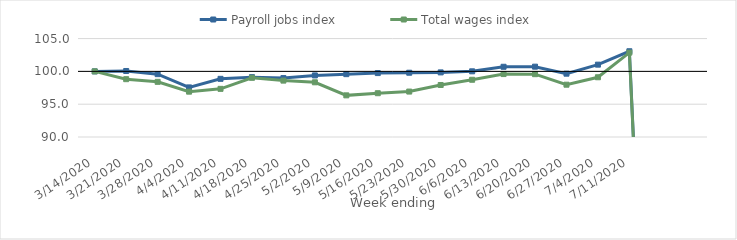
| Category | Payroll jobs index | Total wages index |
|---|---|---|
| 14/03/2020 | 100 | 100 |
| 21/03/2020 | 100.059 | 98.811 |
| 28/03/2020 | 99.578 | 98.405 |
| 04/04/2020 | 97.558 | 96.908 |
| 11/04/2020 | 98.864 | 97.336 |
| 18/04/2020 | 99.121 | 99.022 |
| 25/04/2020 | 98.978 | 98.592 |
| 02/05/2020 | 99.384 | 98.333 |
| 09/05/2020 | 99.575 | 96.346 |
| 16/05/2020 | 99.739 | 96.674 |
| 23/05/2020 | 99.795 | 96.922 |
| 30/05/2020 | 99.845 | 97.926 |
| 06/06/2020 | 100.008 | 98.722 |
| 13/06/2020 | 100.7 | 99.588 |
| 20/06/2020 | 100.717 | 99.573 |
| 27/06/2020 | 99.649 | 97.971 |
| 04/07/2020 | 101.024 | 99.104 |
| 11/07/2020 | 103.066 | 102.854 |